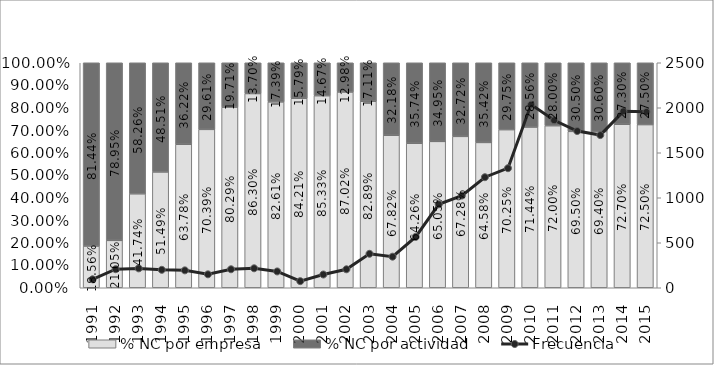
| Category | % NC por empresa | % NC por actividad |
|---|---|---|
| 1991.0 | 0.186 | 0.814 |
| 1992.0 | 0.21 | 0.79 |
| 1993.0 | 0.417 | 0.583 |
| 1994.0 | 0.515 | 0.485 |
| 1995.0 | 0.638 | 0.362 |
| 1996.0 | 0.704 | 0.296 |
| 1997.0 | 0.803 | 0.197 |
| 1998.0 | 0.863 | 0.137 |
| 1999.0 | 0.826 | 0.174 |
| 2000.0 | 0.842 | 0.158 |
| 2001.0 | 0.853 | 0.147 |
| 2002.0 | 0.87 | 0.13 |
| 2003.0 | 0.829 | 0.171 |
| 2004.0 | 0.678 | 0.322 |
| 2005.0 | 0.643 | 0.357 |
| 2006.0 | 0.651 | 0.349 |
| 2007.0 | 0.673 | 0.327 |
| 2008.0 | 0.646 | 0.354 |
| 2009.0 | 0.702 | 0.298 |
| 2010.0 | 0.714 | 0.286 |
| 2011.0 | 0.72 | 0.28 |
| 2012.0 | 0.695 | 0.305 |
| 2013.0 | 0.694 | 0.306 |
| 2014.0 | 0.727 | 0.273 |
| 2015.0 | 0.725 | 0.275 |